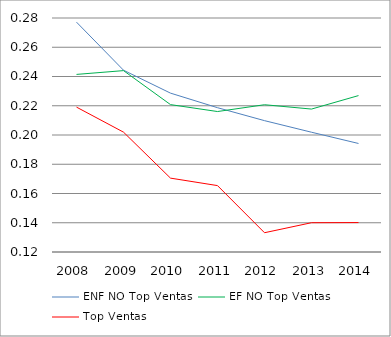
| Category | ENF NO Top Ventas | EF NO Top Ventas | Top Ventas |
|---|---|---|---|
| 2008 | 0.277 | 0.241 | 0.219 |
| 2009 | 0.244 | 0.244 | 0.202 |
| 2010 | 0.229 | 0.221 | 0.171 |
| 2011 | 0.219 | 0.216 | 0.165 |
| 2012 | 0.21 | 0.221 | 0.133 |
| 2013 | 0.202 | 0.218 | 0.14 |
| 2014 | 0.194 | 0.227 | 0.14 |